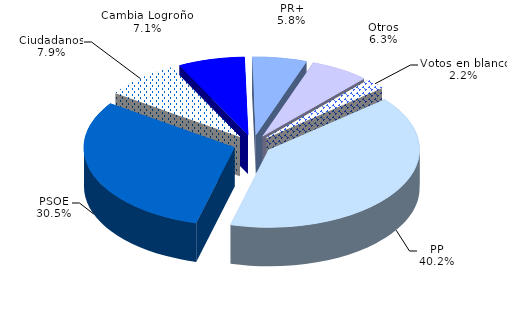
| Category | 2015 |
|---|---|
| PP | 65901 |
| PSOE | 49911 |
| Ciudadanos | 13030 |
| Cambia Logroño | 11680 |
| PR+ | 9567 |
| Otros | 10286 |
| Votos en blanco | 3535 |